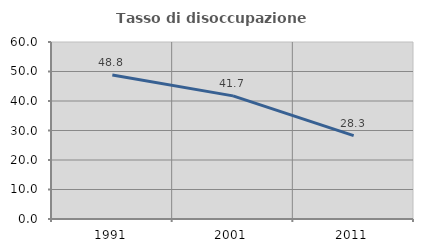
| Category | Tasso di disoccupazione giovanile  |
|---|---|
| 1991.0 | 48.8 |
| 2001.0 | 41.732 |
| 2011.0 | 28.261 |